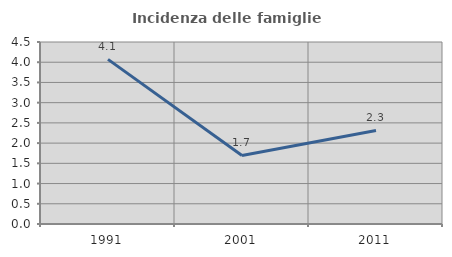
| Category | Incidenza delle famiglie numerose |
|---|---|
| 1991.0 | 4.07 |
| 2001.0 | 1.695 |
| 2011.0 | 2.312 |